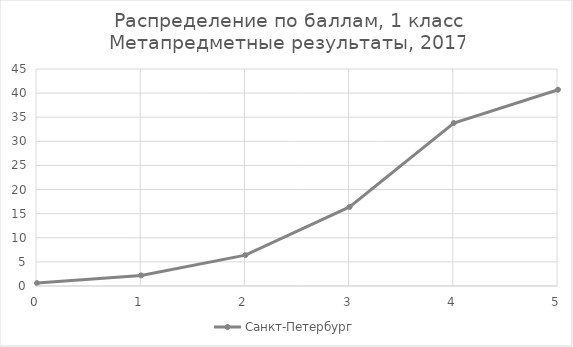
| Category | Санкт-Петербург |
|---|---|
| 0.0 | 0.6 |
| 1.0 | 2.2 |
| 2.0 | 6.4 |
| 3.0 | 16.4 |
| 4.0 | 33.8 |
| 5.0 | 40.7 |